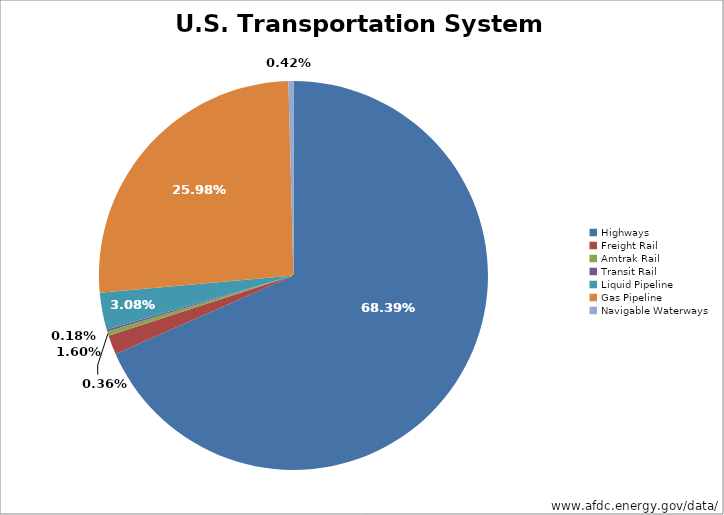
| Category | Series 0 |
|---|---|
| Highways | 4077756 |
| Freight Rail | 95387 |
| Amtrak Rail | 21225 |
| Transit Rail | 10591 |
| Liquid Pipeline | 183370 |
| Gas Pipeline | 1549398 |
| Navigable Waterways | 25000 |